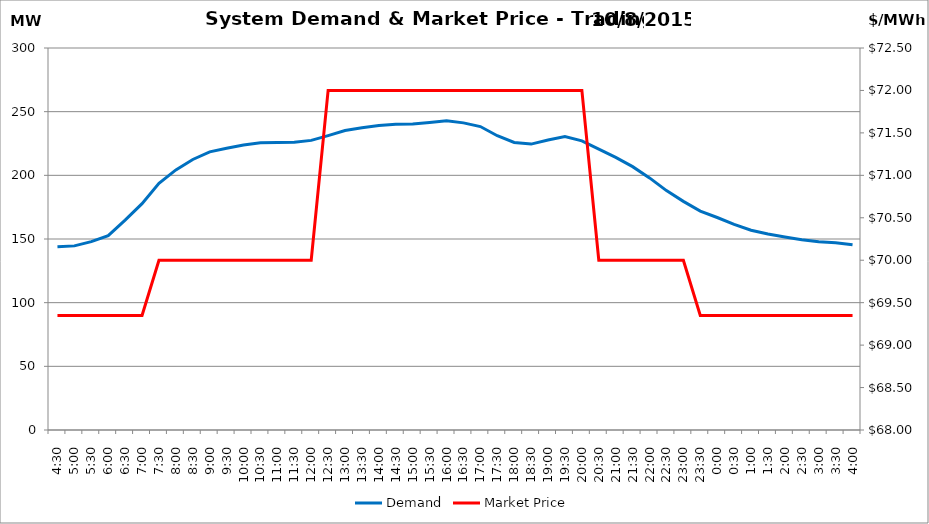
| Category | Demand |
|---|---|
| 0.1875 | 143.99 |
| 0.20833333333333334 | 144.6 |
| 0.22916666666666666 | 147.96 |
| 0.25 | 152.69 |
| 0.270833333333333 | 164.88 |
| 0.291666666666667 | 177.74 |
| 0.3125 | 193.66 |
| 0.333333333333333 | 204.28 |
| 0.354166666666667 | 212.45 |
| 0.375 | 218.42 |
| 0.395833333333333 | 221.27 |
| 0.416666666666667 | 223.78 |
| 0.4375 | 225.54 |
| 0.458333333333333 | 225.69 |
| 0.479166666666667 | 225.93 |
| 0.5 | 227.45 |
| 0.520833333333333 | 231.22 |
| 0.541666666666667 | 235.21 |
| 0.5625 | 237.31 |
| 0.583333333333333 | 239.07 |
| 0.604166666666667 | 240.09 |
| 0.625 | 240.26 |
| 0.645833333333334 | 241.44 |
| 0.666666666666667 | 242.89 |
| 0.6875 | 241.19 |
| 0.708333333333334 | 238.31 |
| 0.729166666666667 | 231.08 |
| 0.75 | 225.79 |
| 0.770833333333334 | 224.54 |
| 0.791666666666667 | 227.77 |
| 0.8125 | 230.54 |
| 0.833333333333334 | 227.06 |
| 0.854166666666667 | 220.51 |
| 0.875 | 214.06 |
| 0.895833333333334 | 206.83 |
| 0.916666666666667 | 197.97 |
| 0.9375 | 187.98 |
| 0.958333333333334 | 179.57 |
| 0.979166666666667 | 171.96 |
| 1900-01-01 | 166.87 |
| 1900-01-01 00:30:00 | 161.54 |
| 1900-01-01 01:00:00 | 156.85 |
| 1900-01-01 01:30:00 | 153.87 |
| 1900-01-01 02:00:00 | 151.54 |
| 1900-01-01 02:30:00 | 149.46 |
| 1900-01-01 03:00:00 | 147.84 |
| 1900-01-01 03:30:00 | 147.04 |
| 1900-01-01 04:00:00 | 145.41 |